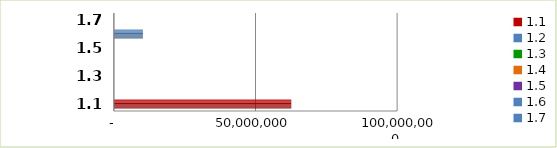
| Category | Series 0 |
|---|---|
| 1.1 | 62634149 |
| 1.2 | 0 |
| 1.3 | 0 |
| 1.4 | 0 |
| 1.5 | 0 |
| 1.6 | 10250000 |
| 1.7 | 0 |